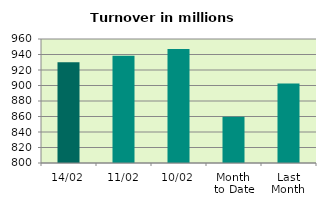
| Category | Series 0 |
|---|---|
| 14/02 | 930.012 |
| 11/02 | 938.427 |
| 10/02 | 947.135 |
| Month 
to Date | 859.577 |
| Last
Month | 902.557 |